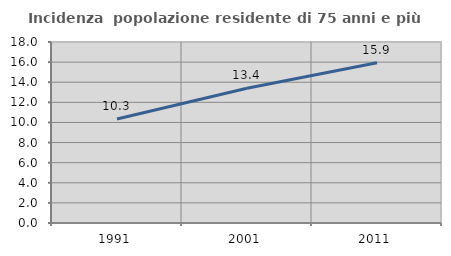
| Category | Incidenza  popolazione residente di 75 anni e più |
|---|---|
| 1991.0 | 10.349 |
| 2001.0 | 13.395 |
| 2011.0 | 15.94 |